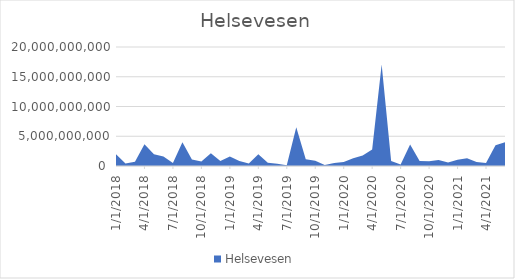
| Category | Helsevesen |
|---|---|
| 1/1/18 | 1963030000 |
| 2/1/18 | 425150000 |
| 3/1/18 | 693550000 |
| 4/1/18 | 3664525000 |
| 5/1/18 | 1954300000 |
| 6/1/18 | 1616380000 |
| 7/1/18 | 508700000 |
| 8/1/18 | 4010350000 |
| 9/1/18 | 1075050000 |
| 10/1/18 | 738550000 |
| 11/1/18 | 2130750000 |
| 12/1/18 | 836350000 |
| 1/1/19 | 1602500000 |
| 2/1/19 | 839000000 |
| 3/1/19 | 441000000 |
| 4/1/19 | 1978000000 |
| 5/1/19 | 525500000 |
| 6/1/19 | 370800000 |
| 7/1/19 | 138000000 |
| 8/1/19 | 6511500000 |
| 9/1/19 | 1132000000 |
| 10/1/19 | 870100000 |
| 11/1/19 | 175000000 |
| 12/1/19 | 525000000 |
| 1/1/20 | 683400000 |
| 2/1/20 | 1304000000 |
| 3/1/20 | 1764500000 |
| 4/1/20 | 2777500000 |
| 5/1/20 | 17046500000 |
| 6/1/20 | 851000000 |
| 7/1/20 | 247500000 |
| 8/1/20 | 3630750000 |
| 9/1/20 | 840000000 |
| 10/1/20 | 805200000 |
| 11/1/20 | 996300000 |
| 12/1/20 | 605000000 |
| 1/1/21 | 1035500000 |
| 2/1/21 | 1296500000 |
| 3/1/21 | 660500000 |
| 4/1/21 | 518200000 |
| 5/1/21 | 3477000000 |
| 6/1/21 | 3988000000 |